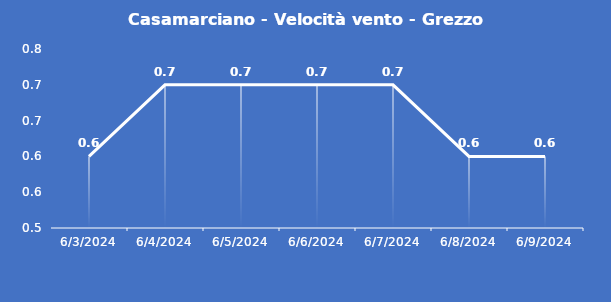
| Category | Casamarciano - Velocità vento - Grezzo (m/s) |
|---|---|
| 6/3/24 | 0.6 |
| 6/4/24 | 0.7 |
| 6/5/24 | 0.7 |
| 6/6/24 | 0.7 |
| 6/7/24 | 0.7 |
| 6/8/24 | 0.6 |
| 6/9/24 | 0.6 |